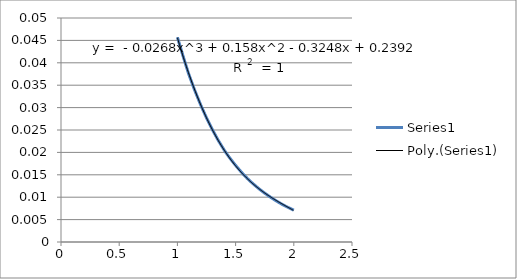
| Category | Series 0 |
|---|---|
| 1.0 | 0.046 |
| 1.1 | 0.037 |
| 1.2 | 0.031 |
| 1.3 | 0.025 |
| 1.4 | 0.021 |
| 1.5 | 0.017 |
| 1.6 | 0.014 |
| 1.7 | 0.012 |
| 1.8 | 0.01 |
| 1.9 | 0.008 |
| 2.0 | 0.007 |